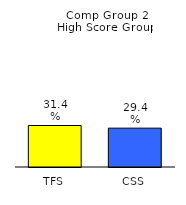
| Category | Series 0 |
|---|---|
| TFS | 0.314 |
| CSS | 0.294 |